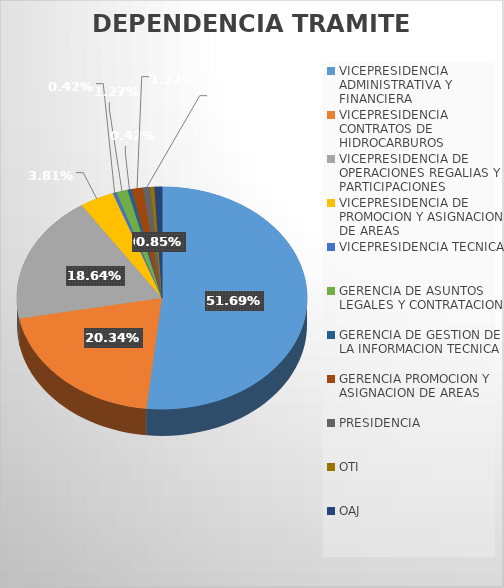
| Category | CANTIDAD |
|---|---|
| VICEPRESIDENCIA ADMINISTRATIVA Y FINANCIERA | 122 |
| VICEPRESIDENCIA CONTRATOS DE HIDROCARBUROS | 48 |
| VICEPRESIDENCIA DE OPERACIONES REGALIAS Y PARTICIPACIONES | 44 |
| VICEPRESIDENCIA DE PROMOCION Y ASIGNACION DE AREAS | 9 |
| VICEPRESIDENCIA TECNICA | 1 |
| GERENCIA DE ASUNTOS LEGALES Y CONTRATACION | 3 |
| GERENCIA DE GESTION DE LA INFORMACION TECNICA | 1 |
| GERENCIA PROMOCION Y ASIGNACION DE AREAS | 3 |
| PRESIDENCIA  | 2 |
| OTI | 1 |
| OAJ | 2 |